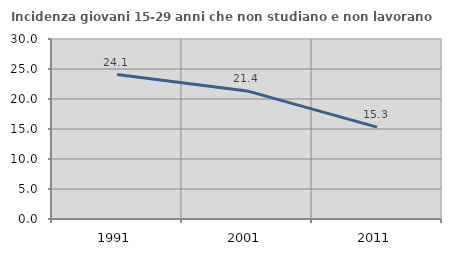
| Category | Incidenza giovani 15-29 anni che non studiano e non lavorano  |
|---|---|
| 1991.0 | 24.074 |
| 2001.0 | 21.351 |
| 2011.0 | 15.306 |